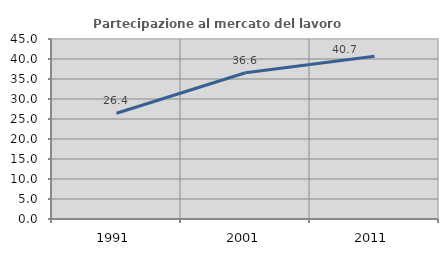
| Category | Partecipazione al mercato del lavoro  femminile |
|---|---|
| 1991.0 | 26.443 |
| 2001.0 | 36.571 |
| 2011.0 | 40.691 |